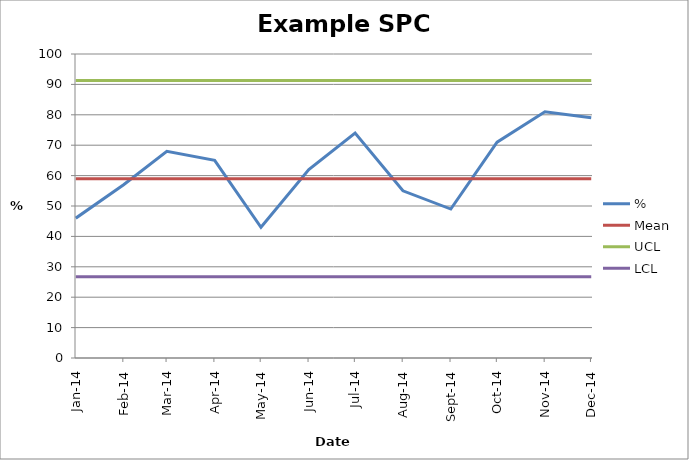
| Category | % | Mean | UCL | LCL |
|---|---|---|---|---|
| 2014-01-01 | 46 | 59 | 91.249 | 26.751 |
| 2014-02-01 | 57 | 59 | 91.249 | 26.751 |
| 2014-03-01 | 68 | 59 | 91.249 | 26.751 |
| 2014-04-01 | 65 | 59 | 91.249 | 26.751 |
| 2014-05-01 | 43 | 59 | 91.249 | 26.751 |
| 2014-06-01 | 62 | 59 | 91.249 | 26.751 |
| 2014-07-01 | 74 | 59 | 91.249 | 26.751 |
| 2014-08-01 | 55 | 59 | 91.249 | 26.751 |
| 2014-09-01 | 49 | 59 | 91.249 | 26.751 |
| 2014-10-01 | 71 | 59 | 91.249 | 26.751 |
| 2014-11-01 | 81 | 59 | 91.249 | 26.751 |
| 2014-12-01 | 79 | 59 | 91.249 | 26.751 |